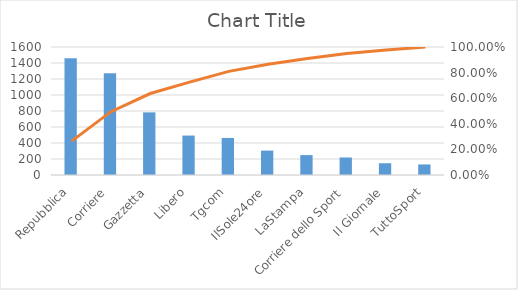
| Category | Series 0 |
|---|---|
| Repubblica | 1460 |
| Corriere | 1273 |
| Gazzetta | 783 |
| Libero | 493 |
| Tgcom | 463 |
| IlSole24ore | 305 |
| LaStampa | 249 |
| Corriere dello Sport | 219 |
| Il Giornale | 147 |
| TuttoSport | 132 |